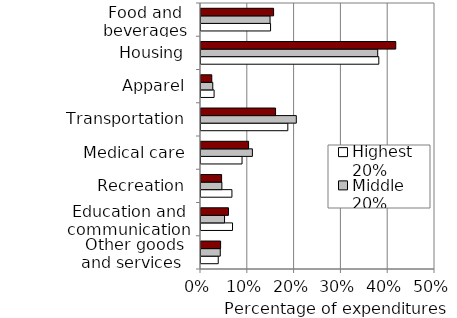
| Category | Highest 20% | Middle 20% | Lowest 20% |
|---|---|---|---|
| Other goods and services  | 0.037 | 0.041 | 0.042 |
| Education and communication | 0.067 | 0.05 | 0.059 |
| Recreation | 0.066 | 0.045 | 0.044 |
| Medical care | 0.088 | 0.11 | 0.102 |
| Transportation | 0.186 | 0.204 | 0.159 |
| Apparel | 0.028 | 0.025 | 0.023 |
| Housing | 0.38 | 0.378 | 0.416 |
| Food and beverages | 0.149 | 0.148 | 0.155 |